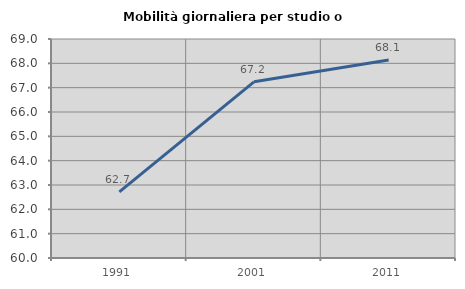
| Category | Mobilità giornaliera per studio o lavoro |
|---|---|
| 1991.0 | 62.715 |
| 2001.0 | 67.241 |
| 2011.0 | 68.141 |